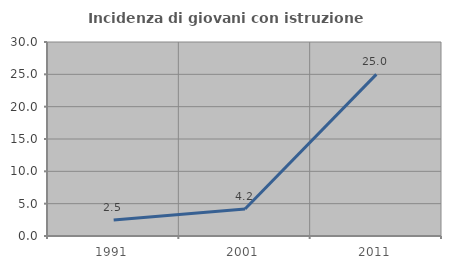
| Category | Incidenza di giovani con istruzione universitaria |
|---|---|
| 1991.0 | 2.469 |
| 2001.0 | 4.167 |
| 2011.0 | 25 |